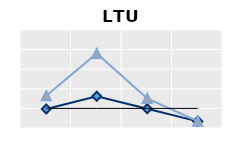
| Category | Public goods | Individual items only | Series 1 |
|---|---|---|---|
| 15-24 | 0.972 | 1.647 | 1 |
| 25-54 | 1.623 | 3.805 | 1 |
| 55-64 | 0.981 | 1.51 | 1 |
| 65+ | 0.338 | 0.346 | 1 |